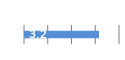
| Category | Series 0 |
|---|---|
| 0 | 3.157 |